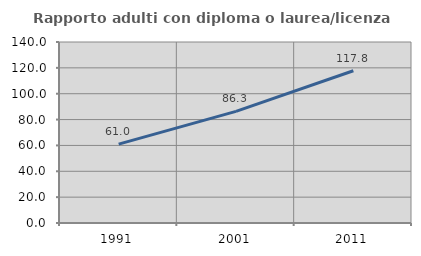
| Category | Rapporto adulti con diploma o laurea/licenza media  |
|---|---|
| 1991.0 | 60.987 |
| 2001.0 | 86.306 |
| 2011.0 | 117.791 |